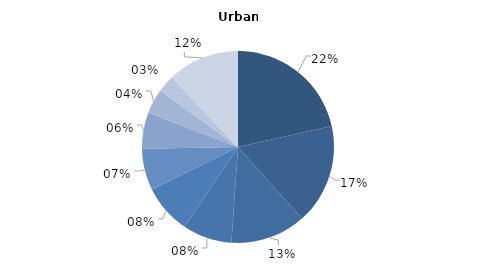
| Category | Urban |
|---|---|
| Tumori  | 21.5 |
| Boli ale aparatului circulator | 16.9 |
| Boli ale sistemului osteo-articular, ale muşchilor şi ţesutului conjunctiv | 12.7 |
| Boli ale sistemului nervos | 8.3 |
| Tulburări mentale şi de comportament | 8.3 |
| Boli endocrine, de nutriție și metabolism | 7 |
| Leziuni traumatice  | 6.1 |
| Boli ale aparatului digestiv | 4.2 |
| Tuberculoză | 2.9 |
| Alte boli | 12.1 |